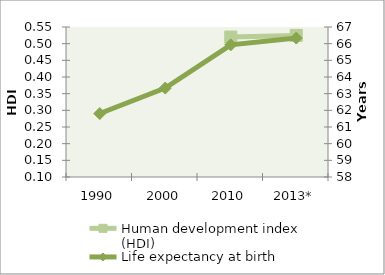
| Category | Human development index (HDI) |
|---|---|
| 1990 | 0 |
| 2000 | 0 |
| 2010 | 0.52 |
| 2013* | 0.525 |